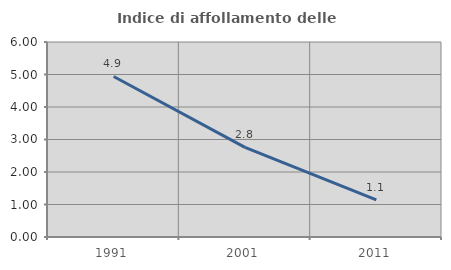
| Category | Indice di affollamento delle abitazioni  |
|---|---|
| 1991.0 | 4.939 |
| 2001.0 | 2.76 |
| 2011.0 | 1.144 |